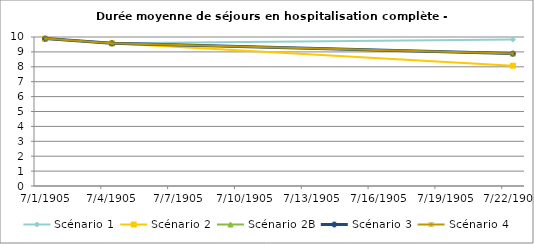
| Category | Scénario 1 | Scénario 2 | Scénario 2B | Scénario 3 | Scénario 4 |
|---|---|---|---|---|---|
| 2009.0 | 9.892 | 9.892 | 9.892 | 9.892 | 9.892 |
| 2012.0 | 9.577 | 9.577 | 9.577 | 9.577 | 9.577 |
| 2030.0 | 9.828 | 8.077 | 8.887 | 8.887 | 8.887 |